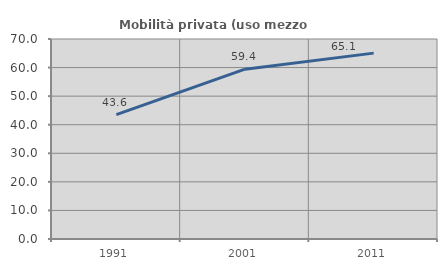
| Category | Mobilità privata (uso mezzo privato) |
|---|---|
| 1991.0 | 43.556 |
| 2001.0 | 59.444 |
| 2011.0 | 65.057 |